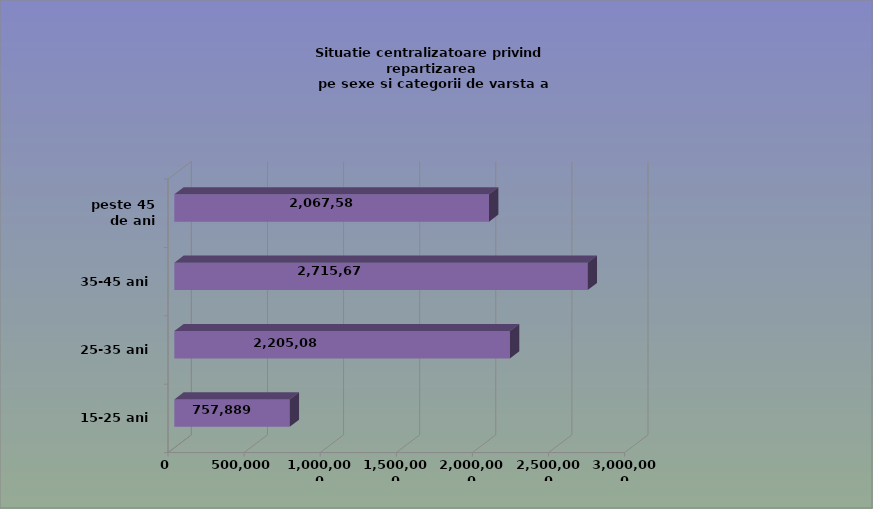
| Category | 15-25 ani 25-35 ani 35-45 ani peste 45 de ani |
|---|---|
| 15-25 ani | 757889 |
| 25-35 ani | 2205082 |
| 35-45 ani | 2715674 |
| peste 45 de ani | 2067588 |